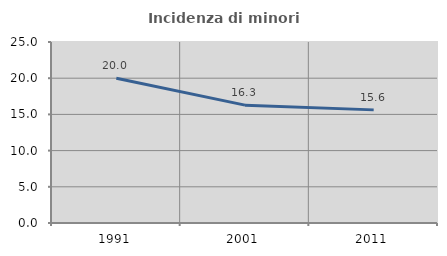
| Category | Incidenza di minori stranieri |
|---|---|
| 1991.0 | 20 |
| 2001.0 | 16.279 |
| 2011.0 | 15.625 |